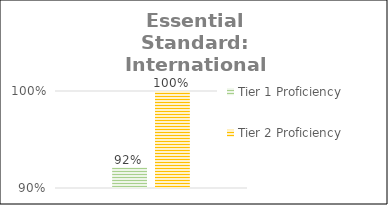
| Category | Tier 1 Proficiency | Tier 2 Proficiency |
|---|---|---|
| 0 | 0.921 | 1 |